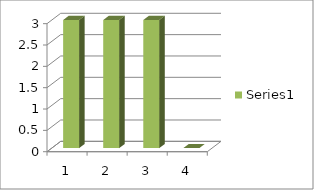
| Category | Series 0 |
|---|---|
| 0 | 3 |
| 1 | 3 |
| 2 | 3 |
| 3 | 0 |